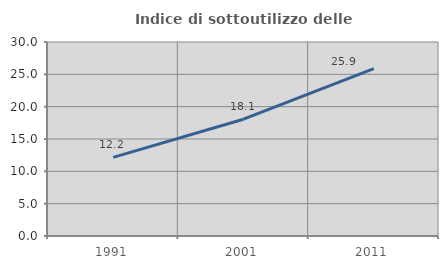
| Category | Indice di sottoutilizzo delle abitazioni  |
|---|---|
| 1991.0 | 12.155 |
| 2001.0 | 18.061 |
| 2011.0 | 25.878 |